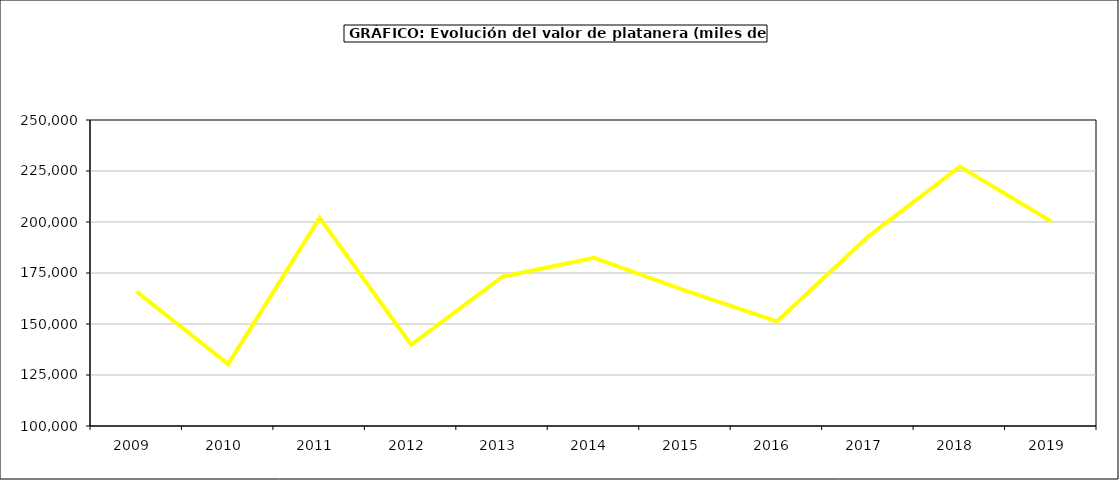
| Category | valor platanera |
|---|---|
| 2009.0 | 165826.349 |
| 2010.0 | 130319.145 |
| 2011.0 | 202014.747 |
| 2012.0 | 139816.382 |
| 2013.0 | 173165.464 |
| 2014.0 | 182466.749 |
| 2015.0 | 166392 |
| 2016.0 | 151266 |
| 2017.0 | 192961.354 |
| 2018.0 | 227178.133 |
| 2019.0 | 200278.061 |